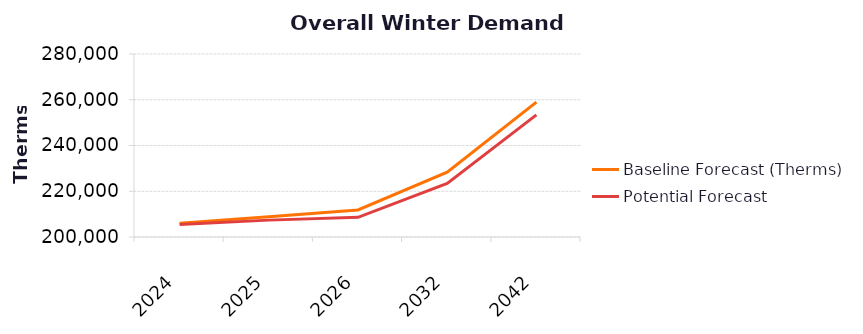
| Category | Baseline Forecast (Therms) | Potential Forecast |
|---|---|---|
| 2024.0 | 205982.536 | 205451.137 |
| 2025.0 | 208851.509 | 207376.982 |
| 2026.0 | 211843.897 | 208588.181 |
| 2032.0 | 228310.994 | 223421.426 |
| 2042.0 | 258983.874 | 253378.971 |